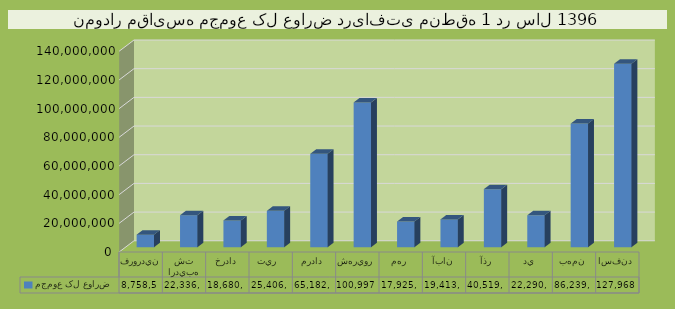
| Category | مجموع کل عوارض  |
|---|---|
| فروردين | 8758548 |
| ارديبهشت | 22336457 |
| خرداد | 18680065 |
| تير  | 25406546 |
| مرداد | 65182419 |
| شهريور | 100997010 |
| مهر | 17925624 |
| آبان | 19413430 |
| آذر | 40519462 |
| دي | 22290671 |
| بهمن | 86239686 |
| اسفند | 127968285 |